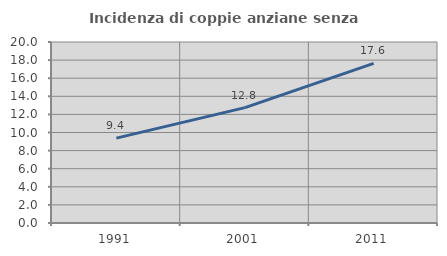
| Category | Incidenza di coppie anziane senza figli  |
|---|---|
| 1991.0 | 9.377 |
| 2001.0 | 12.752 |
| 2011.0 | 17.644 |